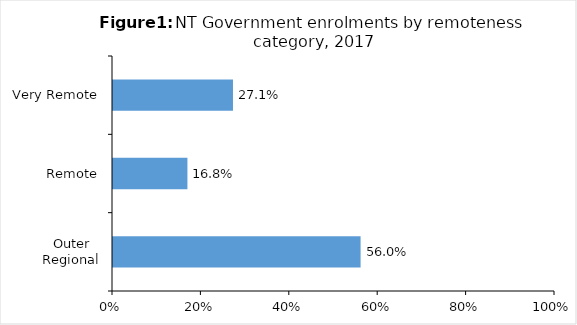
| Category | Series 0 |
|---|---|
| Outer Regional | 0.56 |
| Remote | 0.168 |
| Very Remote | 0.271 |